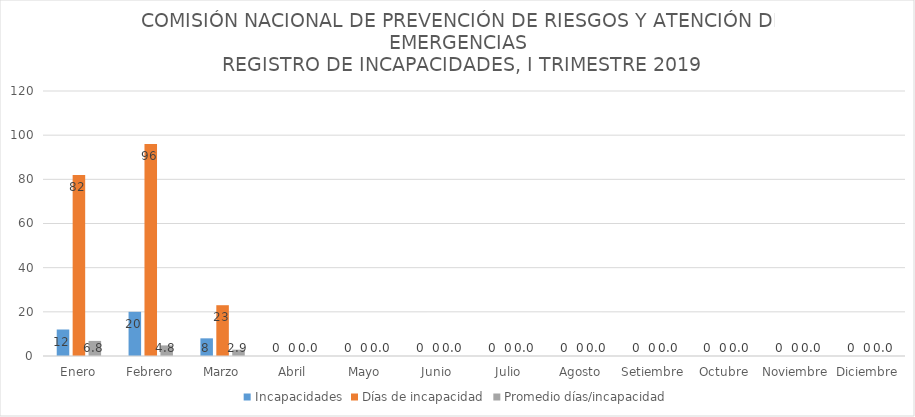
| Category | Incapacidades | Días de incapacidad | Promedio días/incapacidad |
|---|---|---|---|
| Enero | 12 | 82 | 6.833 |
| Febrero | 20 | 96 | 4.8 |
| Marzo | 8 | 23 | 2.875 |
| Abril | 0 | 0 | 0 |
| Mayo | 0 | 0 | 0 |
| Junio | 0 | 0 | 0 |
| Julio | 0 | 0 | 0 |
| Agosto | 0 | 0 | 0 |
| Setiembre | 0 | 0 | 0 |
| Octubre | 0 | 0 | 0 |
| Noviembre | 0 | 0 | 0 |
| Diciembre | 0 | 0 | 0 |